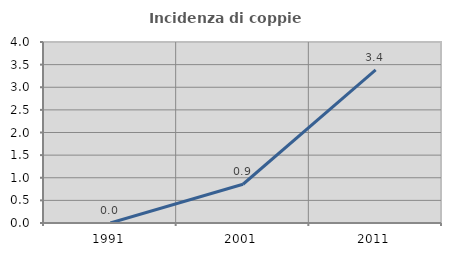
| Category | Incidenza di coppie miste |
|---|---|
| 1991.0 | 0 |
| 2001.0 | 0.857 |
| 2011.0 | 3.383 |